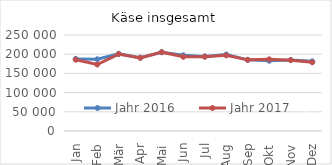
| Category | Jahr 2016 | Jahr 2017 |
|---|---|---|
| 0 | 187779.899 | 185639.596 |
| 1 | 186793.438 | 173107.103 |
| 2 | 200784.046 | 200415.923 |
| 3 | 190878.654 | 190485.142 |
| 4 | 205123.23 | 205298.85 |
| 5 | 197230.513 | 193356.47 |
| 6 | 194133.006 | 193531.529 |
| 7 | 199221.037 | 196940.87 |
| 8 | 185253.825 | 185259.923 |
| 9 | 182986.018 | 186598.467 |
| 10 | 184754.447 | 184504.351 |
| 11 | 181456.118 | 178857.879 |